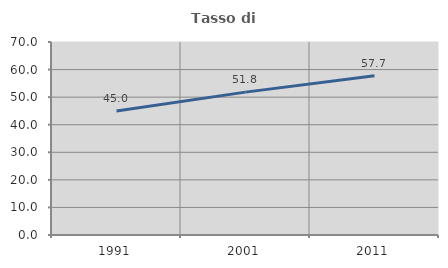
| Category | Tasso di occupazione   |
|---|---|
| 1991.0 | 44.968 |
| 2001.0 | 51.818 |
| 2011.0 | 57.73 |